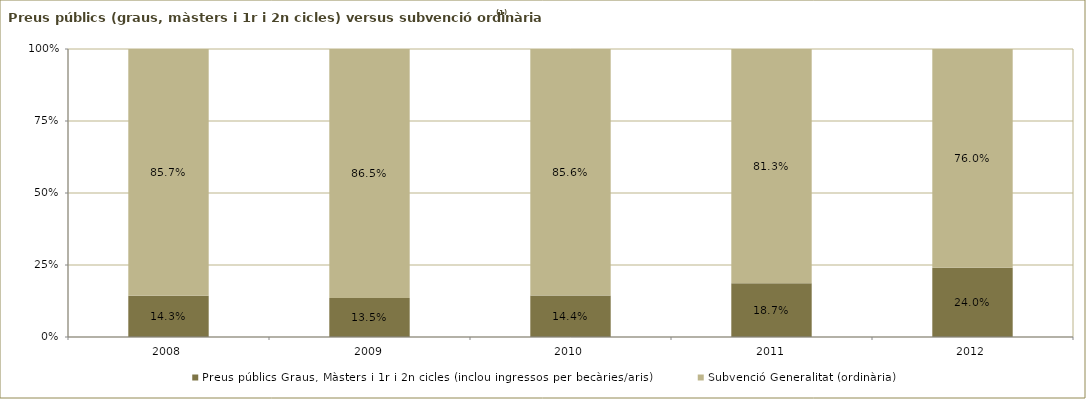
| Category | Preus públics Graus, Màsters i 1r i 2n cicles (inclou ingressos per becàries/aris) | Subvenció Generalitat (ordinària) |
|---|---|---|
| 2008.0 | 0.143 | 0.857 |
| 2009.0 | 0.135 | 0.865 |
| 2010.0 | 0.144 | 0.856 |
| 2011.0 | 0.187 | 0.813 |
| 2012.0 | 0.24 | 0.76 |